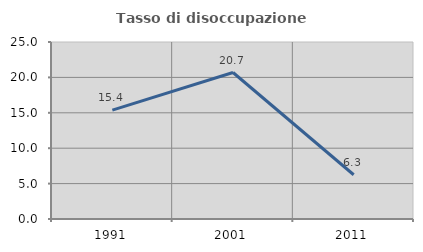
| Category | Tasso di disoccupazione giovanile  |
|---|---|
| 1991.0 | 15.385 |
| 2001.0 | 20.69 |
| 2011.0 | 6.25 |